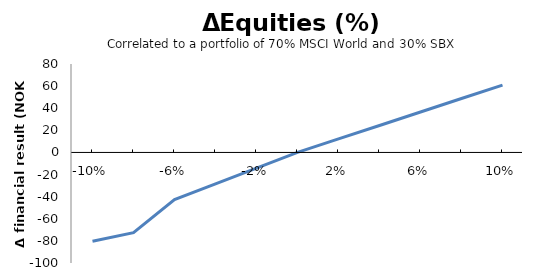
| Category | Series 0 |
|---|---|
| -0.1 | -80.3 |
| -0.08 | -72.588 |
| -0.06 | -42.712 |
| -0.039999999999999994 | -28.474 |
| -0.019999999999999993 | -14.237 |
| 0.0 | 0 |
| 0.02 | 12.208 |
| 0.04 | 24.416 |
| 0.06 | 36.624 |
| 0.08 | 48.832 |
| 0.1 | 60.875 |